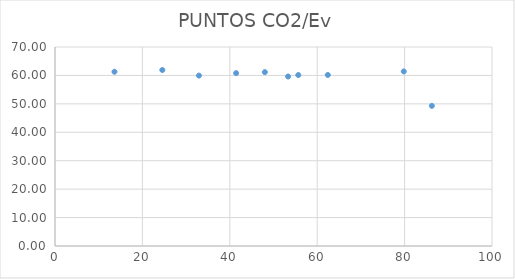
| Category | Series 0 |
|---|---|
| 55.67 | 60.14 |
| 32.94 | 59.945 |
| 53.34000000000001 | 59.619 |
| 79.81 | 61.406 |
| 62.42999999999999 | 60.164 |
| 24.56 | 61.9 |
| 41.45 | 60.804 |
| 48.02 | 61.161 |
| 13.610000000000001 | 61.294 |
| 86.24 | 49.295 |